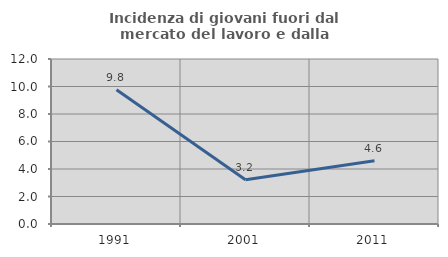
| Category | Incidenza di giovani fuori dal mercato del lavoro e dalla formazione  |
|---|---|
| 1991.0 | 9.756 |
| 2001.0 | 3.226 |
| 2011.0 | 4.598 |